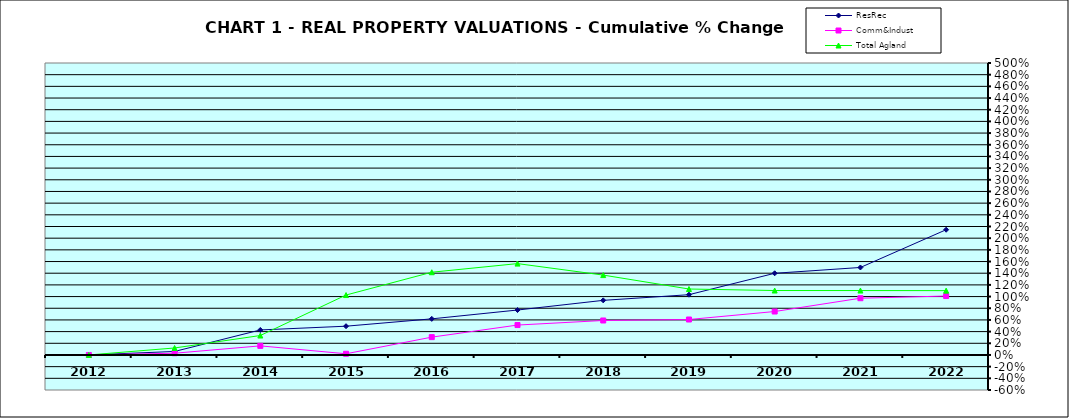
| Category | ResRec | Comm&Indust | Total Agland |
|---|---|---|---|
| 2012.0 | 0 | 0 | 0 |
| 2013.0 | 0.06 | 0.03 | 0.12 |
| 2014.0 | 0.428 | 0.156 | 0.333 |
| 2015.0 | 0.493 | 0.02 | 1.026 |
| 2016.0 | 0.618 | 0.305 | 1.417 |
| 2017.0 | 0.77 | 0.512 | 1.565 |
| 2018.0 | 0.935 | 0.59 | 1.368 |
| 2019.0 | 1.032 | 0.607 | 1.129 |
| 2020.0 | 1.399 | 0.744 | 1.104 |
| 2021.0 | 1.498 | 0.972 | 1.103 |
| 2022.0 | 2.145 | 1.009 | 1.102 |